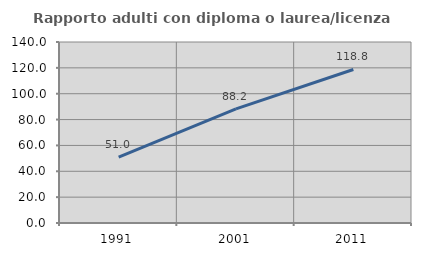
| Category | Rapporto adulti con diploma o laurea/licenza media  |
|---|---|
| 1991.0 | 51.02 |
| 2001.0 | 88.235 |
| 2011.0 | 118.75 |